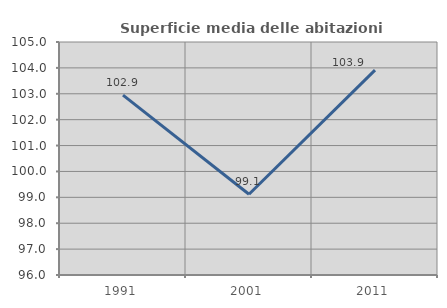
| Category | Superficie media delle abitazioni occupate |
|---|---|
| 1991.0 | 102.949 |
| 2001.0 | 99.118 |
| 2011.0 | 103.914 |